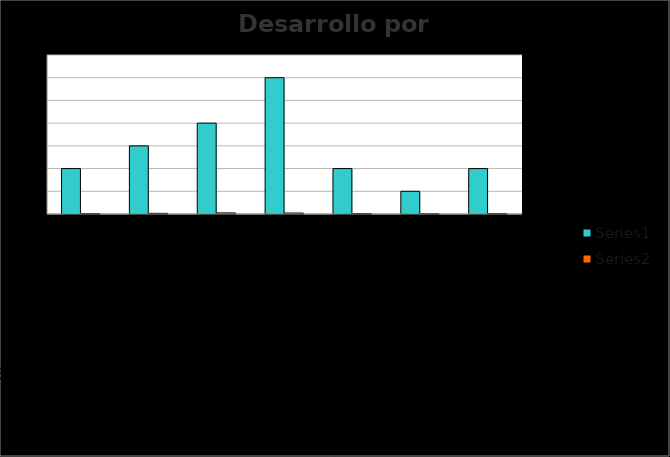
| Category | Series 0 | Series 1 |
|---|---|---|
| RECURSOS | 10 | 0.1 |
| GESTION INTEGRAL DEL SISTEMA DE GESTIÓN DE LA SEGURIDAD Y LA SALUD EN EL TRABAJO | 15 | 0.15 |
| GESTIÓN DE LA SALUD | 20 | 0.24 |
| GESTIÓN DE PELIGROS Y RIESGOS | 30 | 0.21 |
| GESTION DE AMENAZAS | 10 | 0.1 |
| VERIFICACIÓN DEL SG-SST | 5 | 0.05 |
| MEJORAMIENTO | 10 | 0.095 |